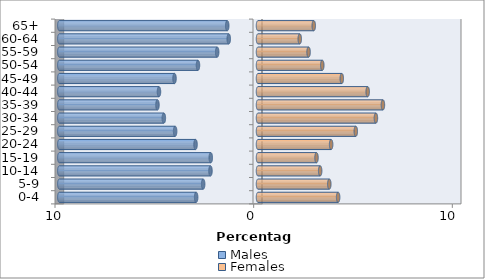
| Category | Males | Females |
|---|---|---|
| 0-4 | -3.113 | 4.034 |
| 5-9 | -2.761 | 3.589 |
| 10-14 | -2.393 | 3.129 |
| 15-19 | -2.377 | 2.945 |
| 20-24 | -3.144 | 3.681 |
| 25-29 | -4.172 | 4.923 |
| 30-34 | -4.739 | 5.936 |
| 35-39 | -5.061 | 6.288 |
| 40-44 | -4.985 | 5.521 |
| 45-49 | -4.202 | 4.218 |
| 50-54 | -3.021 | 3.236 |
| 55-59 | -2.055 | 2.546 |
| 60-64 | -1.472 | 2.101 |
| 65+ | -1.549 | 2.807 |